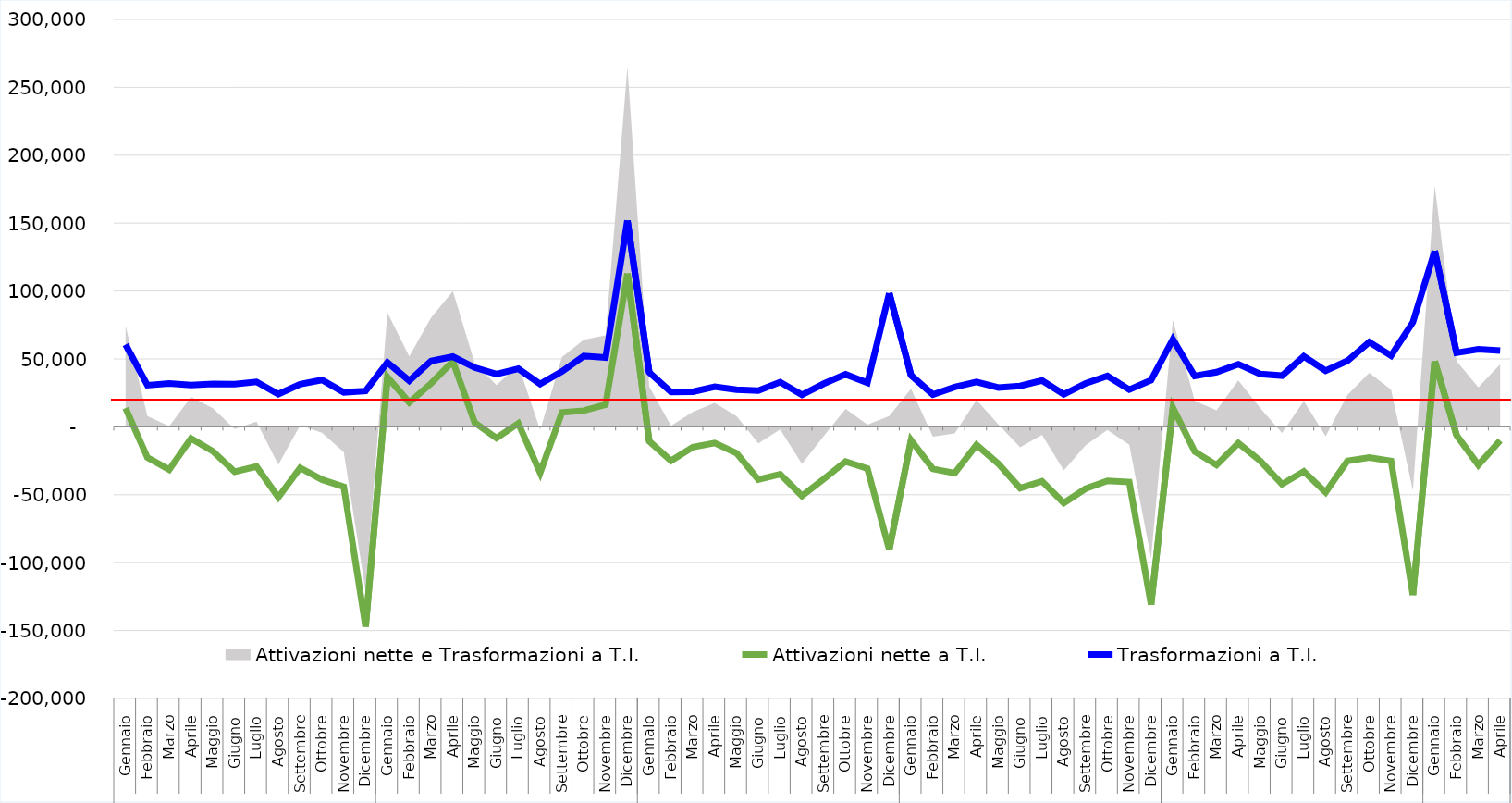
| Category | Attivazioni nette a T.I. | Trasformazioni a T.I. |
|---|---|---|
| 0 | 13801 | 60546 |
| 1 | -22614 | 30630 |
| 2 | -31506 | 31918 |
| 3 | -8593 | 30698 |
| 4 | -17931 | 31622 |
| 5 | -33079 | 31395 |
| 6 | -29219 | 33122 |
| 7 | -51907 | 24123 |
| 8 | -30231 | 31408 |
| 9 | -38837 | 34535 |
| 10 | -44103 | 25410 |
| 11 | -147156 | 26415 |
| 12 | 36671 | 47468 |
| 13 | 17937 | 33982 |
| 14 | 31926 | 48460 |
| 15 | 48245 | 51701 |
| 16 | 3178 | 43672 |
| 17 | -8238 | 38912 |
| 18 | 2562 | 42807 |
| 19 | -33811 | 31512 |
| 20 | 10661 | 40715 |
| 21 | 11939 | 52181 |
| 22 | 16373 | 50946 |
| 23 | 112884 | 151908 |
| 24 | -10591 | 40104 |
| 25 | -24945 | 25658 |
| 26 | -14888 | 25846 |
| 27 | -11876 | 29559 |
| 28 | -19344 | 27299 |
| 29 | -38851 | 26693 |
| 30 | -34848 | 32963 |
| 31 | -50828 | 23551 |
| 32 | -38410 | 31753 |
| 33 | -25518 | 38677 |
| 34 | -30675 | 32374 |
| 35 | -90391 | 98392 |
| 36 | -9821 | 37937 |
| 37 | -31006 | 23783 |
| 38 | -34117 | 29346 |
| 39 | -13254 | 33034 |
| 40 | -27143 | 28914 |
| 41 | -45103 | 30099 |
| 42 | -40010 | 34111 |
| 43 | -56048 | 23917 |
| 44 | -45530 | 32019 |
| 45 | -39771 | 37421 |
| 46 | -40637 | 27436 |
| 47 | -130950 | 34325 |
| 48 | 14141 | 64420 |
| 49 | -18232 | 37401 |
| 50 | -28128 | 40285 |
| 51 | -12037 | 46135 |
| 52 | -24984 | 38958 |
| 53 | -42232 | 37693 |
| 54 | -32826 | 51868 |
| 55 | -48238 | 41383 |
| 56 | -25141 | 48611 |
| 57 | -22615 | 62416 |
| 58 | -25076 | 52444 |
| 59 | -123888 | 77022 |
| 60 | 48258 | 129503 |
| 61 | -6086 | 54527 |
| 62 | -28093 | 57092 |
| 63 | -10081 | 56108 |